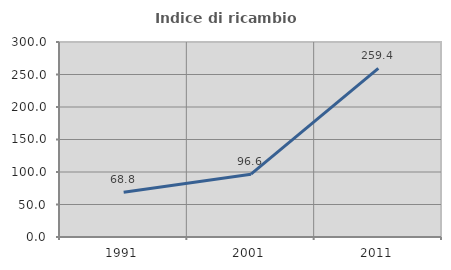
| Category | Indice di ricambio occupazionale  |
|---|---|
| 1991.0 | 68.771 |
| 2001.0 | 96.61 |
| 2011.0 | 259.375 |